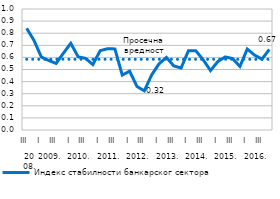
| Category | Индекс стабилности банкарског сектора | Просечна вредност |
|---|---|---|
| 0 | 0.84 | 0.584 |
| 1 | 0.74 | 0.584 |
| 2 | 0.603 | 0.584 |
| 3 | 0.575 | 0.584 |
| 4 | 0.55 | 0.584 |
| 5 | 0.635 | 0.584 |
| 6 | 0.717 | 0.584 |
| 7 | 0.605 | 0.584 |
| 8 | 0.592 | 0.584 |
| 9 | 0.541 | 0.584 |
| 10 | 0.656 | 0.584 |
| 11 | 0.672 | 0.584 |
| 12 | 0.67 | 0.584 |
| 13 | 0.454 | 0.584 |
| 14 | 0.486 | 0.584 |
| 15 | 0.36 | 0.584 |
| 16 | 0.324 | 0.584 |
| 17 | 0.456 | 0.584 |
| 18 | 0.547 | 0.584 |
| 19 | 0.6 | 0.584 |
| 20 | 0.53 | 0.584 |
| 21 | 0.512 | 0.584 |
| 22 | 0.655 | 0.584 |
| 23 | 0.655 | 0.584 |
| 24 | 0.581 | 0.584 |
| 25 | 0.491 | 0.584 |
| 26 | 0.566 | 0.584 |
| 27 | 0.604 | 0.584 |
| 28 | 0.591 | 0.584 |
| 29 | 0.525 | 0.584 |
| 30 | 0.669 | 0.584 |
| 31 | 0.619 | 0.584 |
| 32 | 0.586 | 0.584 |
| 33 | 0.666 | 0.584 |